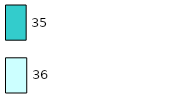
| Category | Series 0 | Series 1 |
|---|---|---|
| 0 | 36 | 35 |